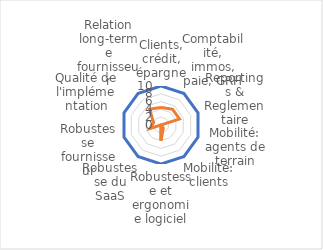
| Category | Ideal | Fournisseur #1 |
|---|---|---|
| Clients, crédit, épargne | 10 | 4.5 |
| Comptabilité, immos, paie, GRH | 10 | 5 |
| Reportings & Reglementaire | 10 | 5 |
| Mobilité: agents de terrain | 10 | 0 |
| Mobilité: clients | 10 | 1 |
| Robustesse et ergonomie logiciel | 10 | 4 |
| Robustesse du SaaS | 10 | 0 |
| Robustesse fournisseur | 10 | 3 |
| Qualité de l'implémentation | 10 | 2 |
| Relation long-terme fournisseur | 10 | 5 |